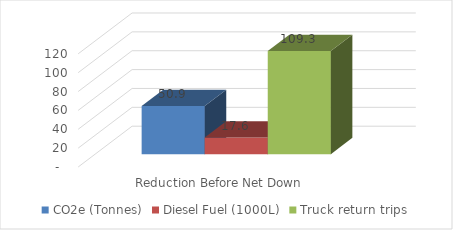
| Category | CO2e (Tonnes) | Diesel Fuel (1000L) | Truck return trips |
|---|---|---|---|
| Reduction Before Net Down | 50.948 | 17.624 | 109.291 |